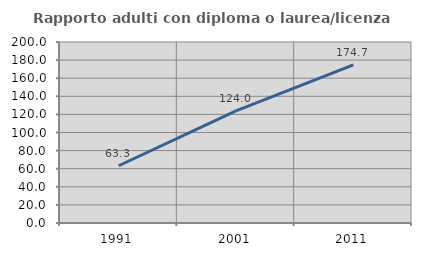
| Category | Rapporto adulti con diploma o laurea/licenza media  |
|---|---|
| 1991.0 | 63.27 |
| 2001.0 | 124.004 |
| 2011.0 | 174.735 |